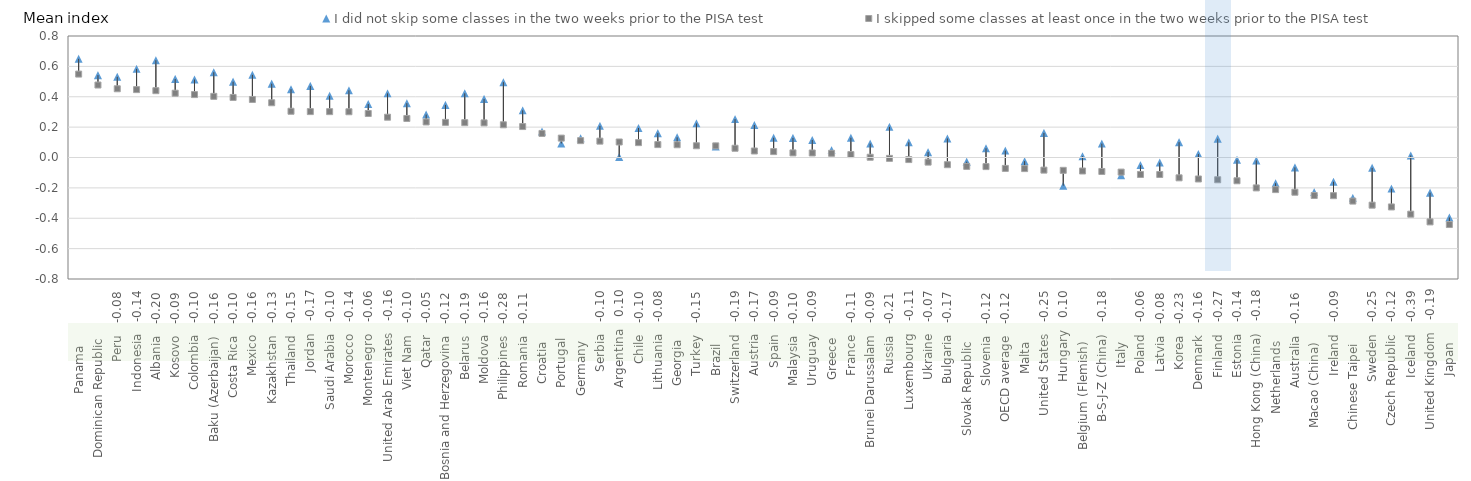
| Category | I did not skip some classes in the two weeks prior to the PISA test | I skipped some classes at least once in the two weeks prior to the PISA test |
|---|---|---|
| Panama               | 0.65 | 0.549 |
| Dominican Republic             | 0.542 | 0.477 |
| Peru   -0.08 | 0.531 | 0.453 |
| Indonesia   -0.14 | 0.584 | 0.447 |
| Albania   -0.20 | 0.641 | 0.44 |
| Kosovo   -0.09 | 0.517 | 0.423 |
| Colombia   -0.10 | 0.514 | 0.414 |
| Baku (Azerbaijan)   -0.16 | 0.561 | 0.403 |
| Costa Rica   -0.10 | 0.499 | 0.395 |
| Mexico   -0.16 | 0.544 | 0.382 |
| Kazakhstan   -0.13 | 0.486 | 0.36 |
| Thailand   -0.15 | 0.45 | 0.304 |
| Jordan   -0.17 | 0.471 | 0.302 |
| Saudi Arabia   -0.10 | 0.406 | 0.302 |
| Morocco   -0.14 | 0.442 | 0.301 |
| Montenegro   -0.06 | 0.352 | 0.29 |
| United Arab Emirates   -0.16 | 0.422 | 0.265 |
| Viet Nam   -0.10 | 0.358 | 0.257 |
| Qatar   -0.05 | 0.283 | 0.234 |
| Bosnia and Herzegovina   -0.12 | 0.346 | 0.231 |
| Belarus   -0.19 | 0.423 | 0.229 |
| Moldova   -0.16 | 0.386 | 0.228 |
| Philippines   -0.28 | 0.496 | 0.215 |
| Romania   -0.11 | 0.311 | 0.204 |
| Croatia              | 0.171 | 0.158 |
| Portugal             | 0.092 | 0.128 |
| Germany              | 0.127 | 0.111 |
| Serbia   -0.10 | 0.208 | 0.108 |
| Argentina   0.10 | 0.004 | 0.102 |
| Chile   -0.10 | 0.195 | 0.098 |
| Lithuania   -0.08 | 0.16 | 0.085 |
| Georgia             | 0.133 | 0.084 |
| Turkey   -0.15 | 0.225 | 0.077 |
| Brazil              | 0.072 | 0.077 |
| Switzerland   -0.19 | 0.253 | 0.061 |
| Austria   -0.17 | 0.214 | 0.043 |
| Spain   -0.09 | 0.13 | 0.039 |
| Malaysia   -0.10 | 0.129 | 0.03 |
| Uruguay   -0.09 | 0.115 | 0.03 |
| Greece             | 0.049 | 0.028 |
| France   -0.11 | 0.13 | 0.019 |
| Brunei Darussalam   -0.09 | 0.092 | 0.002 |
| Russia   -0.21 | 0.202 | -0.006 |
| Luxembourg   -0.11 | 0.1 | -0.014 |
| Ukraine   -0.07 | 0.035 | -0.03 |
| Bulgaria   -0.17 | 0.126 | -0.047 |
| Slovak Republic              | -0.028 | -0.059 |
| Slovenia   -0.12 | 0.061 | -0.06 |
| OECD average   -0.12 | 0.046 | -0.072 |
| Malta              | -0.024 | -0.073 |
| United States   -0.25 | 0.162 | -0.083 |
| Hungary   0.10 | -0.186 | -0.085 |
| Belgium (Flemish)              | 0.008 | -0.089 |
| B-S-J-Z (China)   -0.18 | 0.092 | -0.092 |
| Italy              | -0.117 | -0.096 |
| Poland   -0.06 | -0.05 | -0.112 |
| Latvia   -0.08 | -0.034 | -0.112 |
| Korea   -0.23 | 0.101 | -0.134 |
| Denmark   -0.16 | 0.022 | -0.141 |
| Finland   -0.27 | 0.124 | -0.147 |
| Estonia   -0.14 | -0.015 | -0.153 |
| Hong Kong (China)   -0.18 | -0.019 | -0.2 |
| Netherlands              | -0.17 | -0.211 |
| Australia   -0.16 | -0.065 | -0.229 |
| Macao (China)              | -0.228 | -0.25 |
| Ireland   -0.09 | -0.16 | -0.251 |
| Chinese Taipei              | -0.266 | -0.287 |
| Sweden   -0.25 | -0.068 | -0.314 |
| Czech Republic   -0.12 | -0.205 | -0.326 |
| Iceland   -0.39 | 0.013 | -0.373 |
| United Kingdom   -0.19 | -0.232 | -0.424 |
| Japan              | -0.395 | -0.441 |